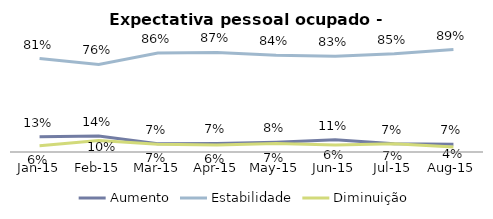
| Category | Aumento | Estabilidade | Diminuição |
|---|---|---|---|
| 2015-01-01 | 0.132 | 0.813 | 0.055 |
| 2015-02-01 | 0.139 | 0.761 | 0.1 |
| 2015-03-01 | 0.072 | 0.861 | 0.067 |
| 2015-04-01 | 0.074 | 0.866 | 0.06 |
| 2015-05-01 | 0.085 | 0.841 | 0.074 |
| 2015-06-01 | 0.106 | 0.834 | 0.06 |
| 2015-07-01 | 0.073 | 0.855 | 0.073 |
| 2015-08-01 | 0.066 | 0.891 | 0.043 |